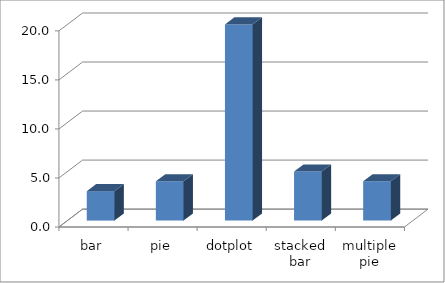
| Category | Series 0 |
|---|---|
| bar | 3 |
| pie | 4 |
| dotplot | 20 |
| stacked bar | 5 |
| multiple pie | 4 |